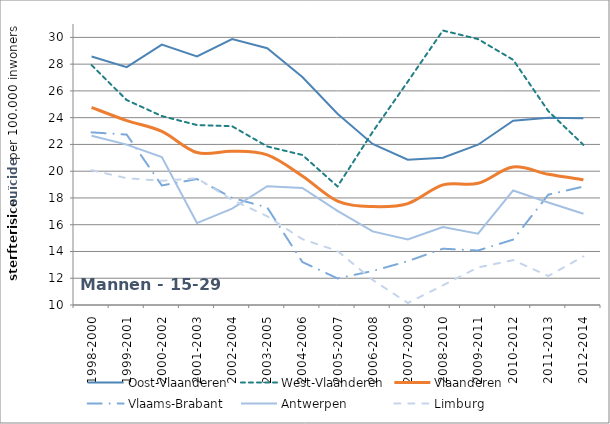
| Category | Oost-Vlaanderen | West-Vlaanderen | Vlaanderen | Vlaams-Brabant | Antwerpen | Limburg |
|---|---|---|---|---|---|---|
| 1998-2000 | 28.571 | 27.926 | 24.768 | 22.902 | 22.647 | 20.078 |
| 1999-2001 | 27.78 | 25.316 | 23.783 | 22.734 | 21.987 | 19.476 |
| 2000-2002 | 29.461 | 24.12 | 22.973 | 18.933 | 21.053 | 19.282 |
| 2001-2003 | 28.58 | 23.45 | 21.394 | 19.415 | 16.123 | 19.469 |
| 2002-2004 | 29.875 | 23.36 | 21.495 | 18.01 | 17.202 | 17.858 |
| 2003-2005 | 29.189 | 21.848 | 21.216 | 17.289 | 18.883 | 16.63 |
| 2004-2006 | 27.043 | 21.213 | 19.642 | 13.212 | 18.75 | 14.921 |
| 2005-2007 | 24.295 | 18.862 | 17.766 | 11.988 | 17.032 | 14.041 |
| 2006-2008 | 22.04 | 22.936 | 17.359 | 12.54 | 15.501 | 11.875 |
| 2007-2009 | 20.862 | 26.692 | 17.581 | 13.274 | 14.903 | 10.154 |
| 2008-2010 | 21.006 | 30.514 | 18.975 | 14.208 | 15.832 | 11.467 |
| 2009-2011 | 21.979 | 29.873 | 19.096 | 14.072 | 15.331 | 12.807 |
| 2010-2012 | 23.768 | 28.323 | 20.313 | 14.888 | 18.558 | 13.353 |
| 2011-2013 | 24.001 | 24.488 | 19.767 | 18.246 | 17.661 | 12.167 |
| 2012-2014 | 23.964 | 21.967 | 19.361 | 18.85 | 16.825 | 13.629 |